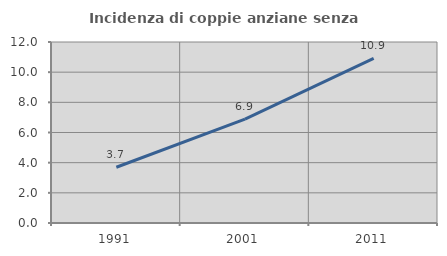
| Category | Incidenza di coppie anziane senza figli  |
|---|---|
| 1991.0 | 3.697 |
| 2001.0 | 6.891 |
| 2011.0 | 10.915 |